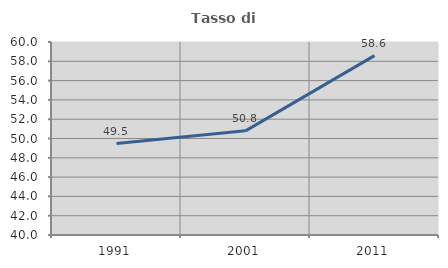
| Category | Tasso di occupazione   |
|---|---|
| 1991.0 | 49.474 |
| 2001.0 | 50.794 |
| 2011.0 | 58.588 |